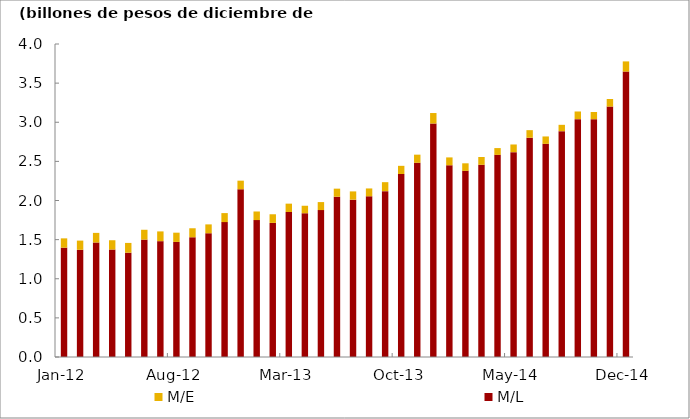
| Category | M/L | M/E |
|---|---|---|
| 2012-01-31 | 1.397 | 0.119 |
| 2012-02-29 | 1.37 | 0.117 |
| 2012-03-31 | 1.463 | 0.123 |
| 2012-04-30 | 1.374 | 0.119 |
| 2012-05-31 | 1.333 | 0.125 |
| 2012-06-30 | 1.5 | 0.126 |
| 2012-07-31 | 1.48 | 0.125 |
| 2012-08-31 | 1.471 | 0.118 |
| 2012-09-30 | 1.53 | 0.115 |
| 2012-10-31 | 1.582 | 0.113 |
| 2012-11-30 | 1.724 | 0.115 |
| 2012-12-31 | 2.144 | 0.11 |
| 2013-01-31 | 1.75 | 0.11 |
| 2013-02-28 | 1.714 | 0.11 |
| 2013-03-31 | 1.853 | 0.107 |
| 2013-04-30 | 1.837 | 0.095 |
| 2013-05-31 | 1.877 | 0.102 |
| 2013-06-30 | 2.048 | 0.103 |
| 2013-07-31 | 2.011 | 0.105 |
| 2013-08-31 | 2.054 | 0.1 |
| 2013-09-30 | 2.12 | 0.114 |
| 2013-10-31 | 2.339 | 0.104 |
| 2013-11-30 | 2.482 | 0.104 |
| 2013-12-31 | 2.984 | 0.134 |
| 2014-01-31 | 2.45 | 0.101 |
| 2014-02-28 | 2.379 | 0.096 |
| 2014-03-31 | 2.456 | 0.1 |
| 2014-04-30 | 2.583 | 0.087 |
| 2014-05-31 | 2.618 | 0.098 |
| 2014-06-30 | 2.802 | 0.097 |
| 2014-07-31 | 2.724 | 0.094 |
| 2014-08-31 | 2.886 | 0.081 |
| 2014-09-30 | 3.04 | 0.098 |
| 2014-10-31 | 3.039 | 0.091 |
| 2014-11-30 | 3.2 | 0.096 |
| 2014-12-31 | 3.648 | 0.13 |